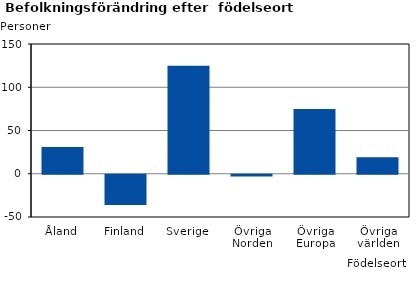
| Category | Series 0 |
|---|---|
| Åland | 31 |
| Finland | -35 |
| Sverige | 125 |
| Övriga Norden | -2 |
| Övriga Europa | 75 |
| Övriga världen | 19 |